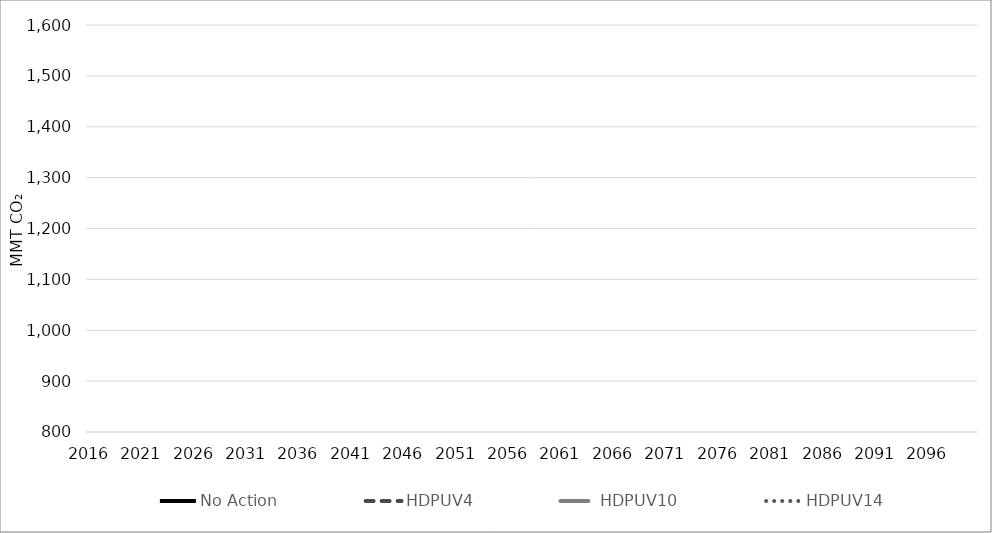
| Category | No Action | HDPUV4 | HDPUV10 | HDPUV14 |
|---|---|---|---|---|
| 2016.0 | 193.479 | 193.479 | 193.479 | 193.479 |
| 2017.0 | 192.435 | 192.435 | 192.435 | 192.435 |
| 2018.0 | 191.39 | 191.39 | 191.39 | 191.39 |
| 2019.0 | 190.345 | 190.345 | 190.345 | 190.345 |
| 2020.0 | 189.301 | 189.301 | 189.301 | 189.301 |
| 2021.0 | 188.256 | 188.256 | 188.256 | 188.256 |
| 2022.0 | 186.311 | 186.311 | 186.311 | 186.311 |
| 2023.0 | 185.738 | 185.738 | 185.738 | 185.738 |
| 2024.0 | 183.938 | 183.938 | 183.938 | 183.938 |
| 2025.0 | 183.389 | 183.389 | 183.389 | 183.389 |
| 2026.0 | 183.412 | 183.412 | 183.412 | 183.412 |
| 2027.0 | 183.345 | 183.345 | 183.345 | 183.345 |
| 2028.0 | 182.85 | 182.85 | 182.85 | 182.85 |
| 2029.0 | 182.907 | 182.907 | 182.907 | 182.907 |
| 2030.0 | 180.18 | 180.177 | 180.171 | 180.161 |
| 2031.0 | 176.631 | 176.627 | 176.609 | 176.285 |
| 2032.0 | 173.176 | 173.169 | 173.14 | 172.541 |
| 2033.0 | 168.914 | 168.903 | 168.707 | 167.66 |
| 2034.0 | 164.89 | 164.873 | 164.522 | 163.064 |
| 2035.0 | 161.361 | 161.34 | 160.841 | 158.778 |
| 2036.0 | 157.484 | 157.46 | 156.802 | 154.171 |
| 2037.0 | 153.761 | 153.733 | 152.926 | 149.715 |
| 2038.0 | 150.391 | 150.36 | 149.413 | 145.659 |
| 2039.0 | 147.38 | 147.348 | 146.283 | 142.005 |
| 2040.0 | 144.669 | 144.633 | 143.469 | 138.696 |
| 2041.0 | 142.303 | 142.259 | 140.997 | 135.855 |
| 2042.0 | 140.232 | 140.182 | 138.83 | 133.332 |
| 2043.0 | 137.974 | 137.915 | 136.486 | 130.897 |
| 2044.0 | 136.01 | 135.943 | 134.443 | 128.765 |
| 2045.0 | 134.292 | 134.219 | 132.653 | 126.923 |
| 2046.0 | 132.727 | 132.647 | 131.025 | 125.259 |
| 2047.0 | 130.669 | 130.588 | 128.919 | 123.287 |
| 2048.0 | 128.821 | 128.74 | 127.026 | 121.511 |
| 2049.0 | 127.02 | 126.941 | 125.192 | 119.926 |
| 2050.0 | 125.297 | 125.221 | 123.443 | 118.417 |
| 2051.0 | 125.233 | 125.156 | 123.38 | 118.356 |
| 2052.0 | 125.169 | 125.092 | 123.316 | 118.295 |
| 2053.0 | 125.104 | 125.028 | 123.253 | 118.234 |
| 2054.0 | 125.04 | 124.963 | 123.189 | 118.174 |
| 2055.0 | 124.975 | 124.899 | 123.126 | 118.113 |
| 2056.0 | 124.911 | 124.835 | 123.062 | 118.052 |
| 2057.0 | 124.847 | 124.77 | 122.999 | 117.991 |
| 2058.0 | 124.782 | 124.706 | 122.936 | 117.93 |
| 2059.0 | 124.718 | 124.642 | 122.872 | 117.869 |
| 2060.0 | 124.653 | 124.577 | 122.809 | 117.808 |
| 2061.0 | 124.589 | 124.513 | 122.745 | 117.748 |
| 2062.0 | 124.525 | 124.449 | 122.682 | 117.687 |
| 2063.0 | 124.46 | 124.384 | 122.618 | 117.626 |
| 2064.0 | 124.396 | 124.32 | 122.555 | 117.565 |
| 2065.0 | 124.331 | 124.255 | 122.491 | 117.504 |
| 2066.0 | 124.294 | 124.218 | 122.455 | 117.469 |
| 2067.0 | 124.257 | 124.181 | 122.418 | 117.434 |
| 2068.0 | 124.22 | 124.144 | 122.382 | 117.399 |
| 2069.0 | 124.183 | 124.107 | 122.345 | 117.364 |
| 2070.0 | 124.146 | 124.07 | 122.308 | 117.329 |
| 2071.0 | 124.109 | 124.033 | 122.272 | 117.293 |
| 2072.0 | 124.071 | 123.996 | 122.235 | 117.258 |
| 2073.0 | 124.034 | 123.959 | 122.199 | 117.223 |
| 2074.0 | 123.997 | 123.921 | 122.162 | 117.188 |
| 2075.0 | 123.96 | 123.884 | 122.125 | 117.153 |
| 2076.0 | 123.923 | 123.847 | 122.089 | 117.118 |
| 2077.0 | 123.886 | 123.81 | 122.052 | 117.083 |
| 2078.0 | 123.849 | 123.773 | 122.016 | 117.048 |
| 2079.0 | 123.811 | 123.736 | 121.979 | 117.013 |
| 2080.0 | 123.774 | 123.699 | 121.943 | 116.978 |
| 2081.0 | 123.197 | 123.122 | 121.374 | 116.432 |
| 2082.0 | 122.621 | 122.546 | 120.806 | 115.887 |
| 2083.0 | 122.044 | 121.969 | 120.238 | 115.342 |
| 2084.0 | 121.467 | 121.393 | 119.669 | 114.797 |
| 2085.0 | 120.89 | 120.816 | 119.101 | 114.252 |
| 2086.0 | 120.313 | 120.24 | 118.533 | 113.706 |
| 2087.0 | 119.736 | 119.663 | 117.964 | 113.161 |
| 2088.0 | 119.159 | 119.087 | 117.396 | 112.616 |
| 2089.0 | 118.583 | 118.51 | 116.828 | 112.071 |
| 2090.0 | 118.006 | 117.934 | 116.259 | 111.526 |
| 2091.0 | 117.429 | 117.357 | 115.691 | 110.981 |
| 2092.0 | 116.852 | 116.781 | 115.123 | 110.435 |
| 2093.0 | 116.275 | 116.204 | 114.554 | 109.89 |
| 2094.0 | 115.698 | 115.628 | 113.986 | 109.345 |
| 2095.0 | 115.121 | 115.051 | 113.418 | 108.8 |
| 2096.0 | 115.121 | 115.051 | 113.418 | 108.8 |
| 2097.0 | 115.121 | 115.051 | 113.418 | 108.8 |
| 2098.0 | 115.121 | 115.051 | 113.418 | 108.8 |
| 2099.0 | 115.121 | 115.051 | 113.418 | 108.8 |
| 2100.0 | 115.121 | 115.051 | 113.418 | 108.8 |